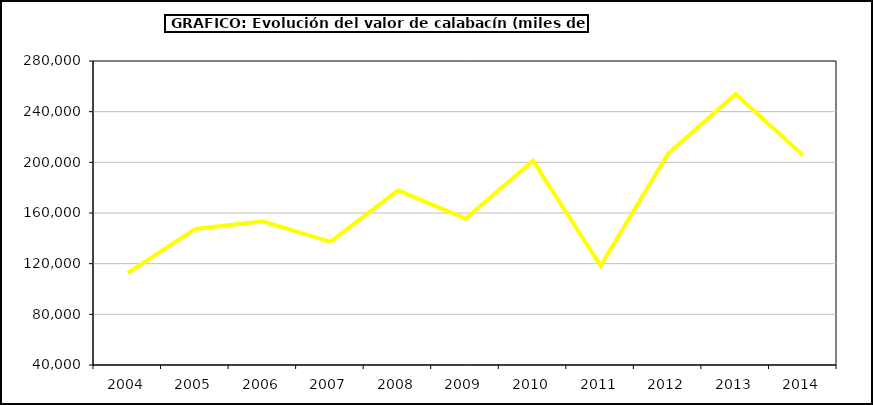
| Category | Valor |
|---|---|
| 2004.0 | 112674.79 |
| 2005.0 | 147357.877 |
| 2006.0 | 153425.95 |
| 2007.0 | 137236.942 |
| 2008.0 | 177885.879 |
| 2009.0 | 155520.785 |
| 2010.0 | 201170.752 |
| 2011.0 | 118311.354 |
| 2012.0 | 207035.363 |
| 2013.0 | 253994.073 |
| 2014.0 | 205307.232 |